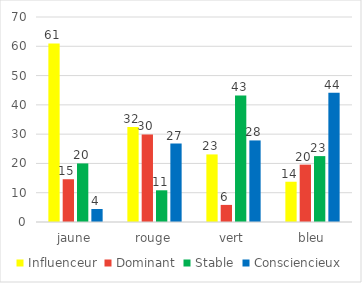
| Category | Influenceur | Dominant | Stable | Consciencieux |
|---|---|---|---|---|
| jaune | 60.952 | 14.603 | 20 | 4.444 |
| rouge | 32.474 | 29.897 | 10.825 | 26.804 |
| vert | 23.077 | 5.836 | 43.236 | 27.851 |
| bleu | 13.75 | 19.583 | 22.5 | 44.167 |